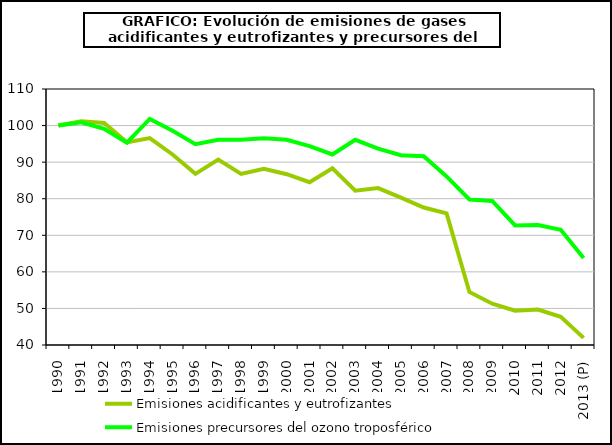
| Category | Emisiones acidificantes y eutrofizantes  | Emisiones precursores del ozono troposférico  |
|---|---|---|
| 1990 | 100 | 100 |
| 1991 | 101.2 | 100.9 |
| 1992 | 100.7 | 99.1 |
| 1993 | 95.4 | 95.3 |
| 1994 | 96.6 | 101.8 |
| 1995 | 92.1 | 98.6 |
| 1996 | 86.8 | 94.9 |
| 1997 | 90.7 | 96.1 |
| 1998 | 86.8 | 96.1 |
| 1999 | 88.2 | 96.5 |
| 2000 | 86.7 | 96.1 |
| 2001 | 84.5 | 94.4 |
| 2002 | 88.3 | 92.1 |
| 2003 | 82.2 | 96.1 |
| 2004 | 82.9 | 93.7 |
| 2005 | 80.3 | 91.9 |
| 2006 | 77.6 | 91.6 |
| 2007 | 76 | 86.1 |
| 2008 | 54.5 | 79.8 |
| 2009 | 51.3 | 79.4 |
| 2010 | 49.4 | 72.7 |
| 2011 | 49.7 | 72.8 |
| 2012 | 47.7 | 71.5 |
| 2013 (P) | 41.944 | 63.811 |